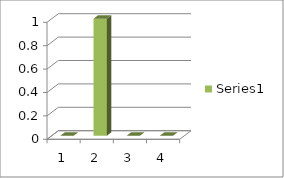
| Category | Series 0 |
|---|---|
| 0 | 0 |
| 1 | 1 |
| 2 | 0 |
| 3 | 0 |